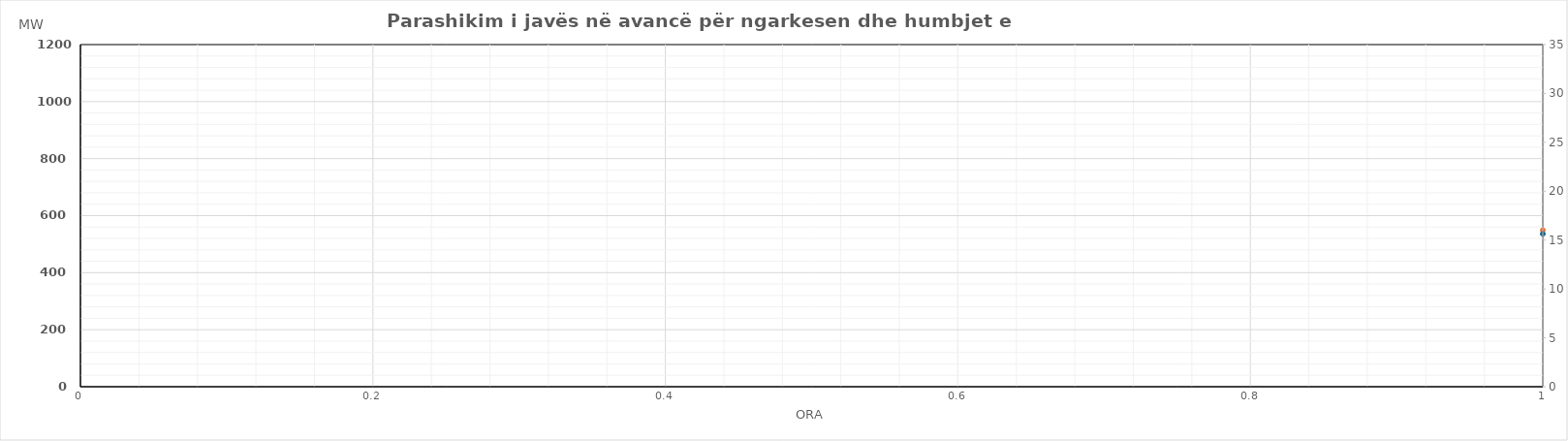
| Category | Ngarkesa (MWh) |
|---|---|
| 0 | 549.26 |
| 1 | 500.78 |
| 2 | 480.66 |
| 3 | 478.87 |
| 4 | 482.08 |
| 5 | 513.67 |
| 6 | 616.78 |
| 7 | 757.85 |
| 8 | 802.98 |
| 9 | 796.28 |
| 10 | 801.97 |
| 11 | 744.37 |
| 12 | 731.59 |
| 13 | 751.72 |
| 14 | 722.18 |
| 15 | 720.37 |
| 16 | 726.4 |
| 17 | 760.85 |
| 18 | 825.37 |
| 19 | 860.77 |
| 20 | 920.69 |
| 21 | 882.2 |
| 22 | 785.34 |
| 23 | 672.27 |
| 24 | 547.48 |
| 25 | 493.05 |
| 26 | 474.84 |
| 27 | 475.1 |
| 28 | 479.22 |
| 29 | 513.38 |
| 30 | 626.01 |
| 31 | 756.4 |
| 32 | 800.99 |
| 33 | 792.68 |
| 34 | 791.97 |
| 35 | 774.3 |
| 36 | 748.04 |
| 37 | 776.15 |
| 38 | 778.58 |
| 39 | 764.01 |
| 40 | 773.77 |
| 41 | 815.97 |
| 42 | 847.15 |
| 43 | 874.84 |
| 44 | 936.46 |
| 45 | 898.55 |
| 46 | 792.12 |
| 47 | 681.55 |
| 48 | 594.81 |
| 49 | 527.87 |
| 50 | 499.19 |
| 51 | 489.48 |
| 52 | 498.88 |
| 53 | 532.17 |
| 54 | 656.91 |
| 55 | 796.15 |
| 56 | 816.73 |
| 57 | 796.57 |
| 58 | 778.1 |
| 59 | 765.69 |
| 60 | 745.94 |
| 61 | 755.69 |
| 62 | 759.8 |
| 63 | 746.63 |
| 64 | 753.37 |
| 65 | 768.72 |
| 66 | 813.24 |
| 67 | 849.76 |
| 68 | 920.94 |
| 69 | 871.79 |
| 70 | 781.99 |
| 71 | 663.76 |
| 72 | 575.46 |
| 73 | 508.01 |
| 74 | 482.95 |
| 75 | 473.11 |
| 76 | 484.82 |
| 77 | 524.45 |
| 78 | 635.95 |
| 79 | 771.48 |
| 80 | 813.11 |
| 81 | 797.13 |
| 82 | 794.52 |
| 83 | 786.19 |
| 84 | 760.34 |
| 85 | 756.68 |
| 86 | 730.49 |
| 87 | 716.04 |
| 88 | 721.22 |
| 89 | 767.09 |
| 90 | 806.76 |
| 91 | 838.65 |
| 92 | 909.71 |
| 93 | 873.41 |
| 94 | 768.26 |
| 95 | 647.6 |
| 96 | 567.22 |
| 97 | 517.27 |
| 98 | 492.99 |
| 99 | 485.95 |
| 100 | 495.26 |
| 101 | 533.19 |
| 102 | 635.4 |
| 103 | 727.73 |
| 104 | 771.26 |
| 105 | 755.98 |
| 106 | 754.32 |
| 107 | 748.49 |
| 108 | 724.99 |
| 109 | 760.73 |
| 110 | 762.79 |
| 111 | 755.37 |
| 112 | 761.49 |
| 113 | 796.36 |
| 114 | 822.73 |
| 115 | 854.7 |
| 116 | 919.09 |
| 117 | 885.07 |
| 118 | 780.8 |
| 119 | 664.83 |
| 120 | 614.1 |
| 121 | 567.61 |
| 122 | 540.73 |
| 123 | 532.15 |
| 124 | 537.74 |
| 125 | 567.17 |
| 126 | 669.91 |
| 127 | 780.96 |
| 128 | 845.06 |
| 129 | 850.19 |
| 130 | 847.05 |
| 131 | 840.34 |
| 132 | 827.9 |
| 133 | 829.5 |
| 134 | 803.44 |
| 135 | 786.11 |
| 136 | 751.24 |
| 137 | 797.54 |
| 138 | 839.6 |
| 139 | 888.71 |
| 140 | 954.59 |
| 141 | 892.25 |
| 142 | 783.84 |
| 143 | 656.36 |
| 144 | 600.36 |
| 145 | 548.72 |
| 146 | 522.45 |
| 147 | 508.23 |
| 148 | 512.7 |
| 149 | 530.11 |
| 150 | 593.83 |
| 151 | 673 |
| 152 | 745.62 |
| 153 | 784.37 |
| 154 | 781.56 |
| 155 | 781.54 |
| 156 | 777.29 |
| 157 | 737.96 |
| 158 | 707.64 |
| 159 | 694.73 |
| 160 | 680.4 |
| 161 | 721.81 |
| 162 | 761.37 |
| 163 | 814.8 |
| 164 | 896.2 |
| 165 | 852.29 |
| 166 | 748.35 |
| 167 | 629.38 |